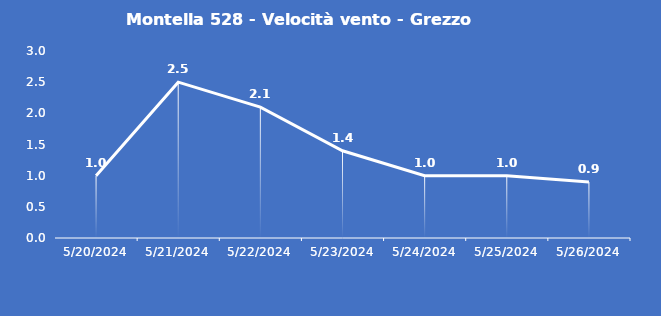
| Category | Montella 528 - Velocità vento - Grezzo (m/s) |
|---|---|
| 5/20/24 | 1 |
| 5/21/24 | 2.5 |
| 5/22/24 | 2.1 |
| 5/23/24 | 1.4 |
| 5/24/24 | 1 |
| 5/25/24 | 1 |
| 5/26/24 | 0.9 |